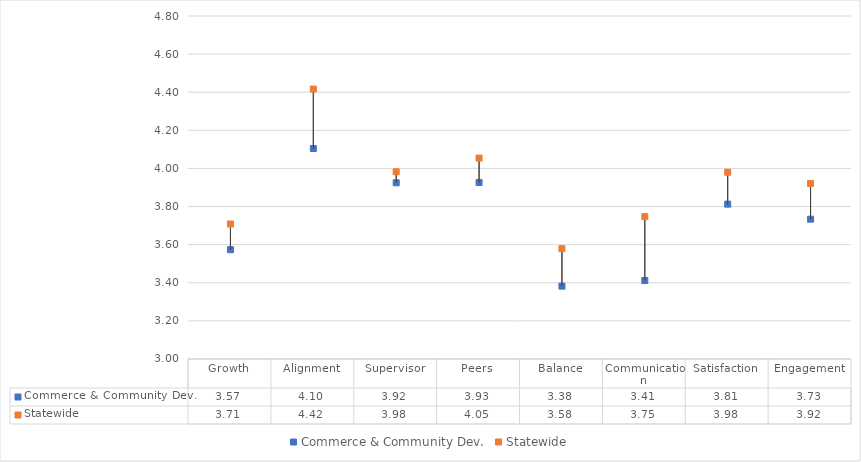
| Category | Commerce & Community Dev. | Statewide |
|---|---|---|
| Growth | 3.574 | 3.708 |
| Alignment | 4.105 | 4.417 |
| Supervisor | 3.925 | 3.983 |
| Peers | 3.926 | 4.054 |
| Balance | 3.382 | 3.579 |
| Communication | 3.412 | 3.747 |
| Satisfaction | 3.813 | 3.98 |
| Engagement | 3.734 | 3.921 |